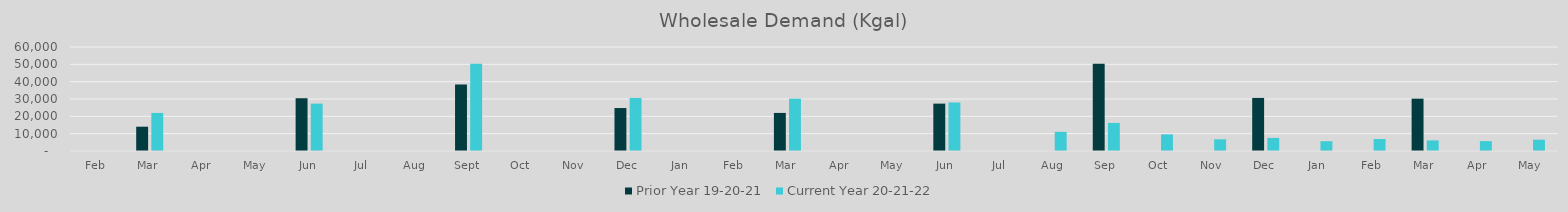
| Category | Prior Year 19-20-21 | Current Year 20-21-22 |
|---|---|---|
| Feb | 0 | 0 |
| Mar | 14013.78 | 21965.02 |
| Apr | 0 | 0 |
| May | 0 | 0 |
| Jun | 30443.6 | 27331 |
| Jul | 0 | 0 |
| Aug | 0 | 0 |
| Sep | 38376.14 | 50400.24 |
| Oct | 0 | 0 |
| Nov | 0 | 0 |
| Dec | 24784.98 | 30611.9 |
| Jan | 0 | 0 |
| Feb | 0 | 0 |
| Mar | 21965.02 | 30196.76 |
| Apr | 0 | 0 |
| May | 0 | 0 |
| Jun | 27331 | 27993.9 |
| Jul | 0 | 0 |
| Aug | 0 | 11056.179 |
| Sep | 50400.24 | 16202.763 |
| Oct | 0 | 9585.62 |
| Nov | 0 | 6754.44 |
| Dec | 30611.9 | 7547.32 |
| Jan | 0 | 5643.66 |
| Feb | 0 | 6907.78 |
| Mar | 30196.76 | 6111.16 |
| Apr | 0 | 5707.24 |
| May | 0 | 6522.56 |